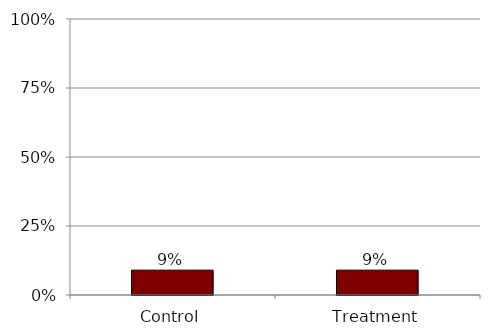
| Category | Series 0 |
|---|---|
| Control | 0.09 |
| Treatment | 0.09 |